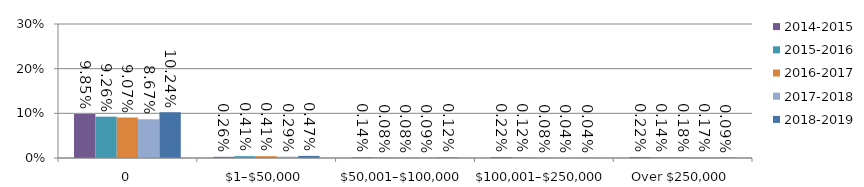
| Category | 2014-2015 | 2015-2016 | 2016-2017 | 2017-2018 | 2018-2019 |
|---|---|---|---|---|---|
| 0 | 0.099 | 0.093 | 0.091 | 0.087 | 0.102 |
| $1–$50,000 | 0.003 | 0.004 | 0.004 | 0.003 | 0.005 |
| $50,001–$100,000 | 0.001 | 0.001 | 0.001 | 0.001 | 0.001 |
| $100,001–$250,000 | 0.002 | 0.001 | 0.001 | 0 | 0 |
| Over $250,000 | 0.002 | 0.001 | 0.002 | 0.002 | 0.001 |